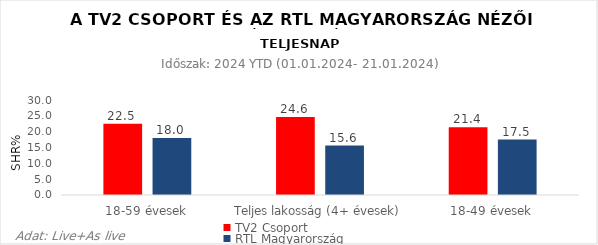
| Category | TV2 Csoport | RTL Magyarország |
|---|---|---|
| 18-59 évesek | 22.5 | 18 |
| Teljes lakosság (4+ évesek) | 24.6 | 15.6 |
| 18-49 évesek | 21.4 | 17.5 |